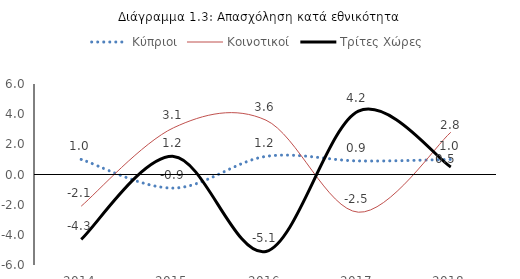
| Category | Κύπριοι | Κοινοτικοί | Τρίτες Χώρες |
|---|---|---|---|
| 2014.0 | 1 | -2.1 | -4.3 |
| 2015.0 | -0.9 | 3.1 | 1.2 |
| 2016.0 | 1.2 | 3.6 | -5.1 |
| 2017.0 | 0.9 | -2.5 | 4.2 |
| 2018.0 | 1 | 2.8 | 0.5 |